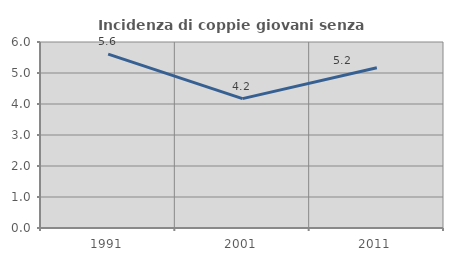
| Category | Incidenza di coppie giovani senza figli |
|---|---|
| 1991.0 | 5.608 |
| 2001.0 | 4.175 |
| 2011.0 | 5.168 |